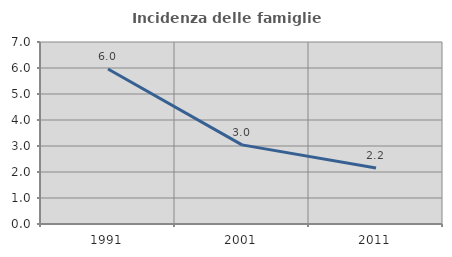
| Category | Incidenza delle famiglie numerose |
|---|---|
| 1991.0 | 5.963 |
| 2001.0 | 3.044 |
| 2011.0 | 2.152 |